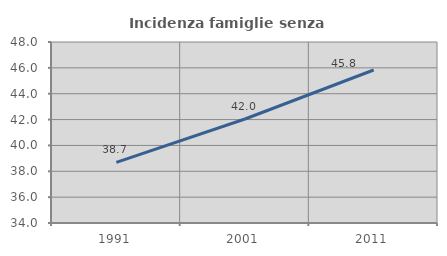
| Category | Incidenza famiglie senza nuclei |
|---|---|
| 1991.0 | 38.689 |
| 2001.0 | 42.045 |
| 2011.0 | 45.833 |